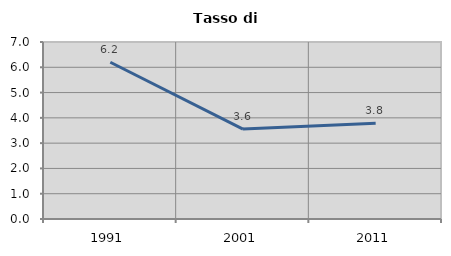
| Category | Tasso di disoccupazione   |
|---|---|
| 1991.0 | 6.198 |
| 2001.0 | 3.557 |
| 2011.0 | 3.785 |